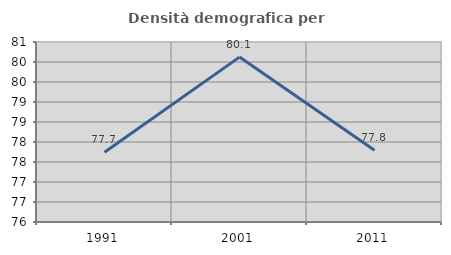
| Category | Densità demografica |
|---|---|
| 1991.0 | 77.745 |
| 2001.0 | 80.122 |
| 2011.0 | 77.792 |